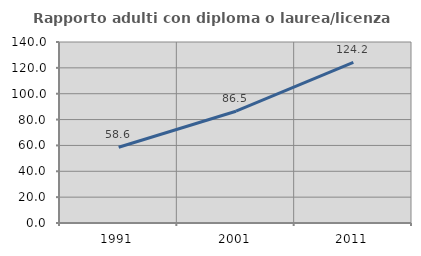
| Category | Rapporto adulti con diploma o laurea/licenza media  |
|---|---|
| 1991.0 | 58.562 |
| 2001.0 | 86.454 |
| 2011.0 | 124.218 |